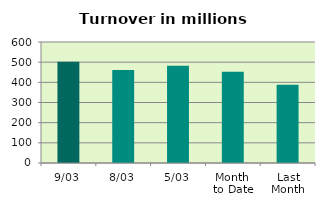
| Category | Series 0 |
|---|---|
| 9/03 | 501.616 |
| 8/03 | 460.696 |
| 5/03 | 482.347 |
| Month 
to Date | 453.048 |
| Last
Month | 387.65 |